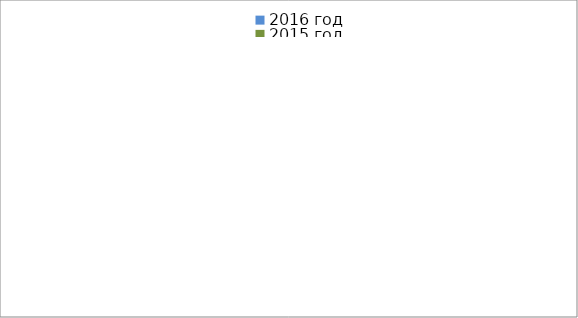
| Category | 2016 год | 2015 год |
|---|---|---|
|  - поджог | 14 | 4 |
|  - неосторожное обращение с огнём | 16 | 18 |
|  - НПТЭ электрооборудования | 2 | 2 |
|  - НПУ и Э печей | 15 | 16 |
|  - НПУ и Э транспортных средств | 9 | 23 |
|   -Шалость с огнем детей | 1 | 1 |
|  -НППБ при эксплуатации эл.приборов | 2 | 8 |
|  - курение | 0 | 8 |
| - прочие | 31 | 66 |
| - не установленные причины | 10 | 2 |